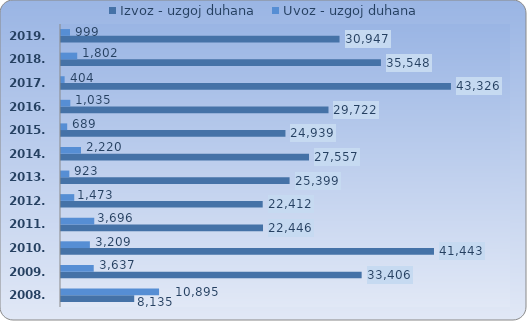
| Category | Izvoz - uzgoj duhana | Uvoz - uzgoj duhana |
|---|---|---|
| 2008.  | 8135.055 | 10894.822 |
| 2009.  | 33405.765 | 3636.873 |
| 2010.  | 41443.15 | 3209.398 |
| 2011.  | 22445.596 | 3695.844 |
| 2012.  | 22411.568 | 1472.885 |
| 2013.  | 25399.097 | 923.004 |
| 2014.  | 27557.168 | 2219.763 |
| 2015.  | 24938.874 | 689.26 |
| 2016.  | 29721.975 | 1035.008 |
| 2017. | 43325.641 | 403.634 |
| 2018. | 35548.165 | 1802.349 |
| 2019. | 30947.339 | 999.105 |